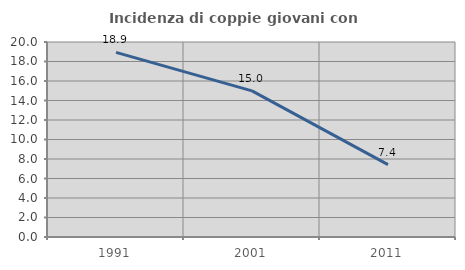
| Category | Incidenza di coppie giovani con figli |
|---|---|
| 1991.0 | 18.942 |
| 2001.0 | 14.992 |
| 2011.0 | 7.421 |